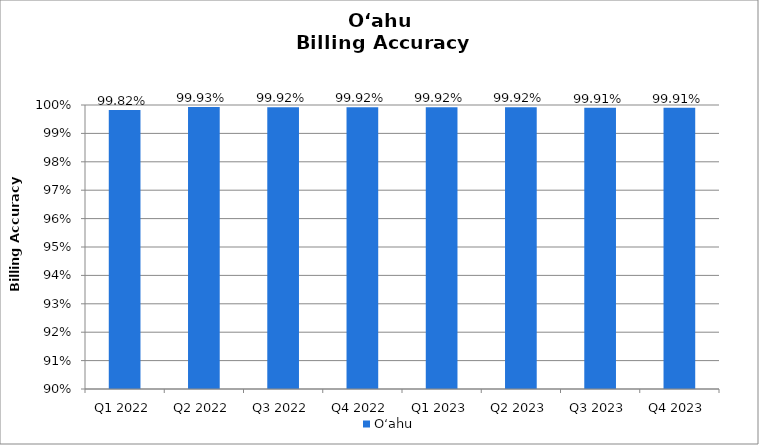
| Category | O‘ahu |
|---|---|
| Q1 2022 | 0.998 |
| Q2 2022 | 0.999 |
| Q3 2022 | 0.999 |
| Q4 2022 | 0.999 |
| Q1 2023 | 0.999 |
| Q2 2023 | 0.999 |
| Q3 2023 | 0.999 |
| Q4 2023 | 0.999 |